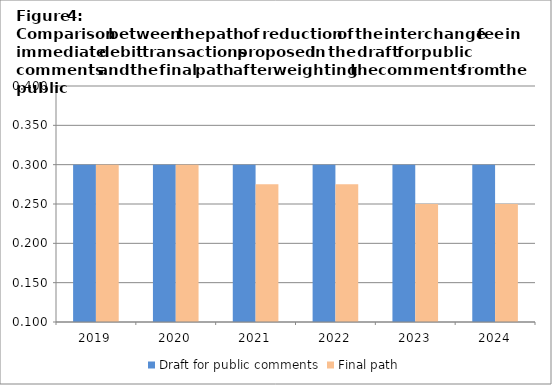
| Category | Draft for public comments | Final path |
|---|---|---|
| 2019.0 | 0.3 | 0.3 |
| 2020.0 | 0.3 | 0.3 |
| 2021.0 | 0.3 | 0.275 |
| 2022.0 | 0.3 | 0.275 |
| 2023.0 | 0.3 | 0.25 |
| 2024.0 | 0.3 | 0.25 |